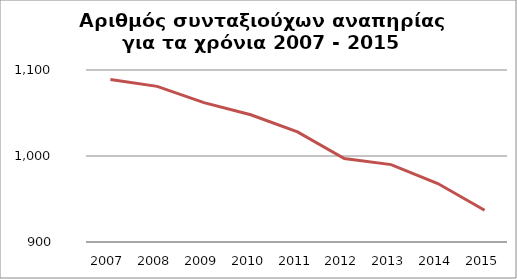
| Category | Series 1 |
|---|---|
| 2007.0 | 1089 |
| 2008.0 | 1081 |
| 2009.0 | 1062 |
| 2010.0 | 1048 |
| 2011.0 | 1028 |
| 2012.0 | 997 |
| 2013.0 | 990 |
| 2014.0 | 968 |
| 2015.0 | 937 |